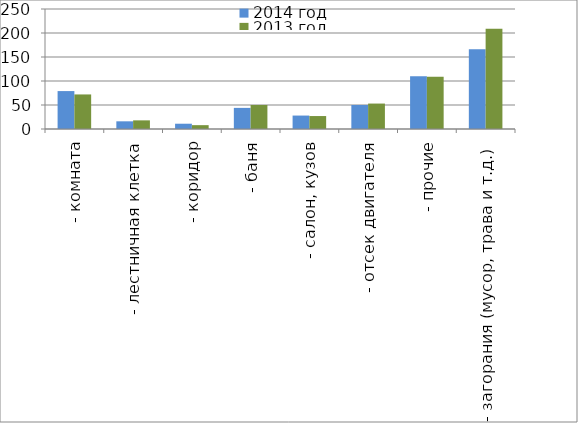
| Category | 2014 год | 2013 год |
|---|---|---|
|  - комната | 79 | 72 |
|  - лестничная клетка | 16 | 18 |
|  - коридор | 11 | 8 |
|  - баня | 44 | 50 |
|  - салон, кузов | 28 | 27 |
|  - отсек двигателя | 50 | 53 |
| - прочие | 110 | 109 |
| - загорания (мусор, трава и т.д.)  | 166 | 209 |